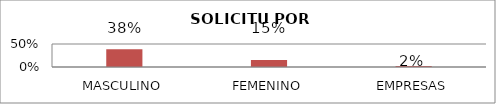
| Category | Series 1 |
|---|---|
| MASCULINO | 0.385 |
| FEMENINO | 0.154 |
| EMPRESAS | 0.019 |